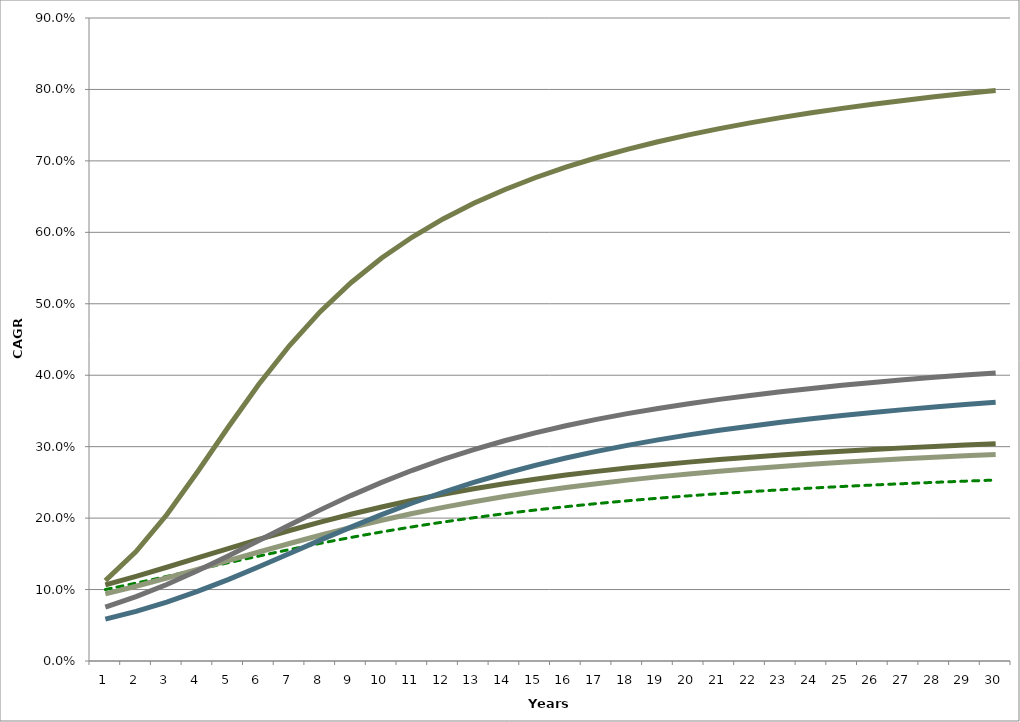
| Category | Aspirational Return Curve | #N/A | Biogen Inc | Credit Acceptance | Evertec Inc | Kla | Texas Pacific Land Trust |
|---|---|---|---|---|---|---|---|
| 1.0 | 0.1 |  | 0.107 | 0.094 | 0.076 | 0.059 | 0.112 |
| 2.0 | 0.109 |  | 0.119 | 0.105 | 0.09 | 0.07 | 0.153 |
| 3.0 | 0.118 |  | 0.131 | 0.116 | 0.107 | 0.083 | 0.205 |
| 4.0 | 0.128 |  | 0.144 | 0.128 | 0.126 | 0.097 | 0.265 |
| 5.0 | 0.137 |  | 0.157 | 0.14 | 0.147 | 0.114 | 0.327 |
| 6.0 | 0.147 |  | 0.17 | 0.153 | 0.169 | 0.132 | 0.387 |
| 7.0 | 0.156 |  | 0.183 | 0.164 | 0.19 | 0.15 | 0.442 |
| 8.0 | 0.165 |  | 0.194 | 0.176 | 0.212 | 0.169 | 0.489 |
| 9.0 | 0.173 |  | 0.205 | 0.187 | 0.232 | 0.187 | 0.529 |
| 10.0 | 0.181 |  | 0.216 | 0.197 | 0.25 | 0.205 | 0.564 |
| 11.0 | 0.188 |  | 0.225 | 0.206 | 0.267 | 0.221 | 0.593 |
| 12.0 | 0.194 |  | 0.233 | 0.215 | 0.282 | 0.236 | 0.619 |
| 13.0 | 0.201 |  | 0.241 | 0.223 | 0.296 | 0.25 | 0.641 |
| 14.0 | 0.206 |  | 0.248 | 0.23 | 0.308 | 0.262 | 0.66 |
| 15.0 | 0.211 |  | 0.254 | 0.237 | 0.319 | 0.274 | 0.676 |
| 16.0 | 0.216 |  | 0.26 | 0.243 | 0.329 | 0.284 | 0.691 |
| 17.0 | 0.22 |  | 0.265 | 0.248 | 0.338 | 0.293 | 0.704 |
| 18.0 | 0.224 |  | 0.27 | 0.253 | 0.346 | 0.302 | 0.716 |
| 19.0 | 0.228 |  | 0.274 | 0.258 | 0.354 | 0.309 | 0.727 |
| 20.0 | 0.231 |  | 0.278 | 0.262 | 0.36 | 0.316 | 0.736 |
| 21.0 | 0.234 |  | 0.282 | 0.266 | 0.366 | 0.323 | 0.745 |
| 22.0 | 0.237 |  | 0.285 | 0.269 | 0.372 | 0.329 | 0.753 |
| 23.0 | 0.24 |  | 0.288 | 0.272 | 0.377 | 0.334 | 0.761 |
| 24.0 | 0.242 |  | 0.291 | 0.275 | 0.382 | 0.339 | 0.767 |
| 25.0 | 0.244 |  | 0.294 | 0.278 | 0.386 | 0.344 | 0.774 |
| 26.0 | 0.246 |  | 0.296 | 0.281 | 0.39 | 0.348 | 0.779 |
| 27.0 | 0.248 |  | 0.298 | 0.283 | 0.394 | 0.352 | 0.785 |
| 28.0 | 0.25 |  | 0.3 | 0.285 | 0.397 | 0.356 | 0.79 |
| 29.0 | 0.252 |  | 0.302 | 0.287 | 0.4 | 0.359 | 0.794 |
| 30.0 | 0.253 |  | 0.304 | 0.289 | 0.403 | 0.362 | 0.799 |